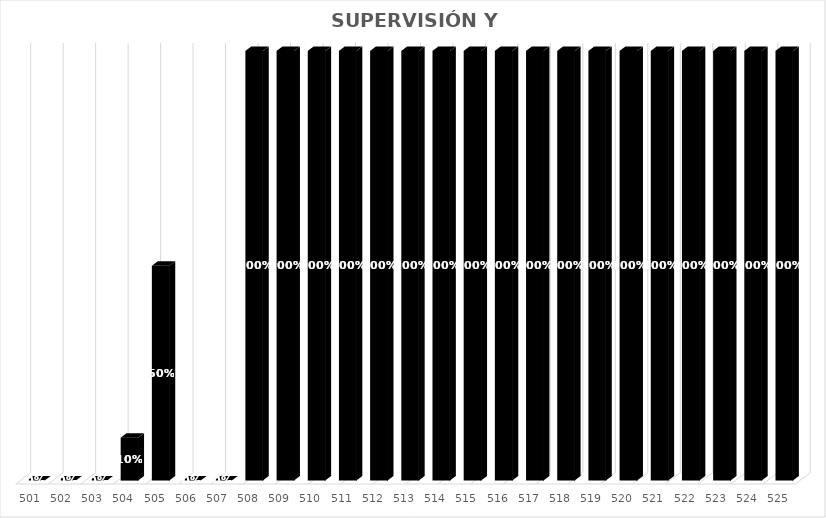
| Category | % Avance |
|---|---|
| 501.0 | 0 |
| 502.0 | 0 |
| 503.0 | 0 |
| 504.0 | 0.1 |
| 505.0 | 0.5 |
| 506.0 | 0 |
| 507.0 | 0 |
| 508.0 | 1 |
| 509.0 | 1 |
| 510.0 | 1 |
| 511.0 | 1 |
| 512.0 | 1 |
| 513.0 | 1 |
| 514.0 | 1 |
| 515.0 | 1 |
| 516.0 | 1 |
| 517.0 | 1 |
| 518.0 | 1 |
| 519.0 | 1 |
| 520.0 | 1 |
| 521.0 | 1 |
| 522.0 | 1 |
| 523.0 | 1 |
| 524.0 | 1 |
| 525.0 | 1 |